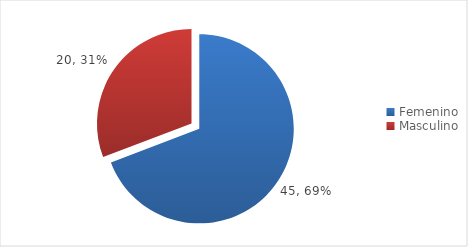
| Category | Series 0 |
|---|---|
| Femenino | 45 |
| Masculino | 20 |